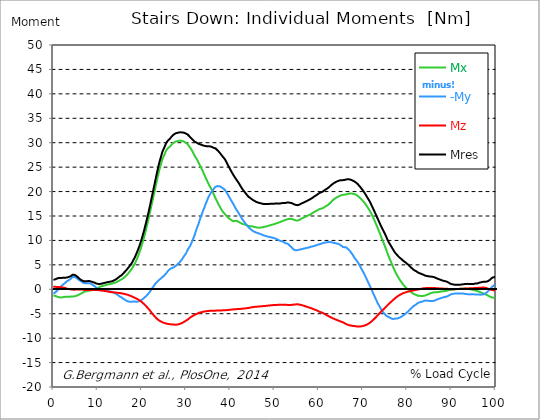
| Category |  Mx |  -My |  Mz |  Mres |
|---|---|---|---|---|
| 0.0 | -1.25 | -0.88 | 0.52 | 1.96 |
| 0.167348456675344 | -1.29 | -0.81 | 0.52 | 1.97 |
| 0.334696913350688 | -1.33 | -0.72 | 0.52 | 2 |
| 0.5020453700260321 | -1.39 | -0.57 | 0.49 | 2.09 |
| 0.669393826701376 | -1.45 | -0.42 | 0.49 | 2.15 |
| 0.83674228337672 | -1.5 | -0.27 | 0.49 | 2.22 |
| 1.0040907400520642 | -1.55 | -0.13 | 0.49 | 2.25 |
| 1.1621420602454444 | -1.6 | 0.01 | 0.5 | 2.3 |
| 1.3294905169207885 | -1.64 | 0.17 | 0.48 | 2.34 |
| 1.4968389735961325 | -1.66 | 0.33 | 0.44 | 2.32 |
| 1.6641874302714765 | -1.67 | 0.49 | 0.41 | 2.31 |
| 1.8315358869468206 | -1.66 | 0.65 | 0.39 | 2.31 |
| 1.9988843436221646 | -1.65 | 0.81 | 0.37 | 2.34 |
| 2.1662328002975086 | -1.63 | 0.96 | 0.35 | 2.35 |
| 2.333581256972853 | -1.59 | 1.08 | 0.33 | 2.35 |
| 2.5009297136481967 | -1.56 | 1.18 | 0.29 | 2.37 |
| 2.6682781703235405 | -1.54 | 1.29 | 0.26 | 2.38 |
| 2.8356266269988843 | -1.52 | 1.4 | 0.22 | 2.38 |
| 3.002975083674229 | -1.54 | 1.61 | 0.15 | 2.39 |
| 3.1703235403495724 | -1.53 | 1.68 | 0.12 | 2.44 |
| 3.337671997024917 | -1.52 | 1.76 | 0.08 | 2.48 |
| 3.4957233172182973 | -1.51 | 1.86 | 0.05 | 2.52 |
| 3.663071773893641 | -1.51 | 1.98 | 0.02 | 2.59 |
| 3.8304202305689854 | -1.5 | 2.09 | 0.01 | 2.65 |
| 3.997768687244329 | -1.49 | 2.2 | -0.02 | 2.72 |
| 4.165117143919673 | -1.49 | 2.36 | -0.04 | 2.85 |
| 4.332465600595017 | -1.49 | 2.52 | -0.06 | 2.98 |
| 4.499814057270361 | -1.47 | 2.57 | -0.07 | 3.01 |
| 4.667162513945706 | -1.45 | 2.55 | -0.09 | 2.98 |
| 4.834510970621049 | -1.43 | 2.51 | -0.1 | 2.94 |
| 5.001859427296393 | -1.39 | 2.45 | -0.06 | 2.86 |
| 5.169207883971737 | -1.33 | 2.37 | -0.04 | 2.76 |
| 5.336556340647081 | -1.28 | 2.26 | -0.03 | 2.64 |
| 5.503904797322425 | -1.22 | 2.13 | -0.03 | 2.49 |
| 5.671253253997769 | -1.16 | 2 | -0.02 | 2.35 |
| 5.82930457419115 | -1.09 | 1.9 | -0.03 | 2.23 |
| 5.996653030866494 | -1.01 | 1.77 | -0.03 | 2.08 |
| 6.164001487541838 | -0.93 | 1.68 | -0.04 | 1.97 |
| 6.331349944217181 | -0.84 | 1.6 | -0.04 | 1.88 |
| 6.498698400892526 | -0.75 | 1.49 | -0.06 | 1.79 |
| 6.66604685756787 | -0.67 | 1.39 | -0.08 | 1.71 |
| 6.833395314243213 | -0.59 | 1.31 | -0.1 | 1.66 |
| 7.000743770918558 | -0.52 | 1.26 | -0.12 | 1.63 |
| 7.168092227593902 | -0.47 | 1.24 | -0.14 | 1.64 |
| 7.335440684269246 | -0.42 | 1.25 | -0.15 | 1.66 |
| 7.50278914094459 | -0.38 | 1.24 | -0.16 | 1.66 |
| 7.6701375976199335 | -0.33 | 1.23 | -0.17 | 1.66 |
| 7.837486054295278 | -0.3 | 1.25 | -0.17 | 1.68 |
| 7.995537374488658 | -0.28 | 1.26 | -0.17 | 1.7 |
| 8.162885831164003 | -0.27 | 1.24 | -0.15 | 1.68 |
| 8.330234287839346 | -0.25 | 1.2 | -0.15 | 1.65 |
| 8.49758274451469 | -0.23 | 1.14 | -0.15 | 1.6 |
| 8.664931201190035 | -0.19 | 1.04 | -0.14 | 1.55 |
| 8.832279657865378 | -0.14 | 0.95 | -0.13 | 1.48 |
| 8.999628114540721 | -0.09 | 0.84 | -0.14 | 1.45 |
| 9.166976571216066 | -0.05 | 0.72 | -0.15 | 1.42 |
| 9.334325027891412 | 0.01 | 0.6 | -0.15 | 1.36 |
| 9.501673484566755 | 0.07 | 0.47 | -0.14 | 1.26 |
| 9.669021941242098 | 0.12 | 0.36 | -0.15 | 1.18 |
| 9.836370397917442 | 0.19 | 0.25 | -0.15 | 1.15 |
| 10.003718854592787 | 0.25 | 0.13 | -0.17 | 1.13 |
| 10.17106731126813 | 0.32 | 0 | -0.17 | 1.08 |
| 10.329118631461512 | 0.42 | -0.16 | -0.18 | 1.05 |
| 10.496467088136853 | 0.49 | -0.2 | -0.2 | 1.08 |
| 10.663815544812199 | 0.55 | -0.18 | -0.23 | 1.11 |
| 10.831164001487544 | 0.59 | -0.09 | -0.26 | 1.12 |
| 10.998512458162887 | 0.65 | -0.06 | -0.28 | 1.17 |
| 11.16586091483823 | 0.7 | -0.05 | -0.29 | 1.23 |
| 11.333209371513574 | 0.73 | -0.07 | -0.31 | 1.25 |
| 11.50055782818892 | 0.77 | -0.11 | -0.32 | 1.29 |
| 11.667906284864264 | 0.81 | -0.18 | -0.34 | 1.33 |
| 11.835254741539607 | 0.85 | -0.23 | -0.36 | 1.37 |
| 12.00260319821495 | 0.91 | -0.3 | -0.39 | 1.41 |
| 12.169951654890292 | 0.96 | -0.35 | -0.42 | 1.46 |
| 12.337300111565641 | 0.99 | -0.36 | -0.46 | 1.48 |
| 12.504648568240984 | 1.02 | -0.37 | -0.5 | 1.5 |
| 12.662699888434362 | 1.05 | -0.41 | -0.53 | 1.53 |
| 12.830048345109708 | 1.07 | -0.42 | -0.56 | 1.55 |
| 12.997396801785053 | 1.1 | -0.44 | -0.58 | 1.58 |
| 13.164745258460396 | 1.13 | -0.48 | -0.6 | 1.6 |
| 13.33209371513574 | 1.17 | -0.55 | -0.61 | 1.65 |
| 13.499442171811083 | 1.22 | -0.63 | -0.62 | 1.72 |
| 13.666790628486426 | 1.28 | -0.72 | -0.63 | 1.81 |
| 13.834139085161771 | 1.31 | -0.74 | -0.65 | 1.86 |
| 14.001487541837117 | 1.36 | -0.81 | -0.67 | 1.94 |
| 14.16883599851246 | 1.43 | -0.91 | -0.68 | 2.04 |
| 14.336184455187803 | 1.5 | -1.01 | -0.7 | 2.16 |
| 14.503532911863147 | 1.58 | -1.12 | -0.71 | 2.26 |
| 14.670881368538492 | 1.66 | -1.24 | -0.73 | 2.38 |
| 14.828932688731873 | 1.74 | -1.34 | -0.75 | 2.49 |
| 14.996281145407215 | 1.83 | -1.48 | -0.76 | 2.64 |
| 15.163629602082558 | 1.91 | -1.56 | -0.78 | 2.74 |
| 15.330978058757903 | 1.99 | -1.61 | -0.82 | 2.82 |
| 15.498326515433247 | 2.07 | -1.7 | -0.85 | 2.95 |
| 15.665674972108594 | 2.17 | -1.84 | -0.88 | 3.11 |
| 15.833023428783937 | 2.27 | -1.94 | -0.91 | 3.26 |
| 16.00037188545928 | 2.4 | -2.05 | -0.94 | 3.43 |
| 16.167720342134626 | 2.53 | -2.14 | -0.98 | 3.59 |
| 16.335068798809967 | 2.68 | -2.22 | -1.02 | 3.75 |
| 16.502417255485312 | 2.82 | -2.31 | -1.05 | 3.92 |
| 16.669765712160658 | 2.97 | -2.41 | -1.09 | 4.1 |
| 16.837114168836 | 3.14 | -2.45 | -1.14 | 4.27 |
| 17.004462625511344 | 3.34 | -2.5 | -1.2 | 4.48 |
| 17.16251394570472 | 3.54 | -2.54 | -1.25 | 4.68 |
| 17.32986240238007 | 3.72 | -2.57 | -1.31 | 4.87 |
| 17.497210859055414 | 3.9 | -2.58 | -1.37 | 5.07 |
| 17.664559315730756 | 4.11 | -2.55 | -1.43 | 5.28 |
| 17.8319077724061 | 4.34 | -2.48 | -1.5 | 5.53 |
| 17.999256229081443 | 4.59 | -2.51 | -1.57 | 5.81 |
| 18.166604685756788 | 4.86 | -2.56 | -1.63 | 6.11 |
| 18.333953142432133 | 5.12 | -2.52 | -1.69 | 6.39 |
| 18.501301599107478 | 5.4 | -2.51 | -1.77 | 6.7 |
| 18.668650055782823 | 5.73 | -2.53 | -1.85 | 7.05 |
| 18.835998512458165 | 6.08 | -2.53 | -1.93 | 7.41 |
| 19.00334696913351 | 6.42 | -2.53 | -2.01 | 7.78 |
| 19.170695425808855 | 6.79 | -2.51 | -2.1 | 8.15 |
| 19.338043882484197 | 7.2 | -2.44 | -2.19 | 8.56 |
| 19.496095202677576 | 7.64 | -2.42 | -2.29 | 8.98 |
| 19.66344365935292 | 8.09 | -2.36 | -2.39 | 9.43 |
| 19.830792116028263 | 8.57 | -2.26 | -2.5 | 9.89 |
| 19.998140572703612 | 9.05 | -2.14 | -2.62 | 10.39 |
| 20.165489029378953 | 9.55 | -2.01 | -2.76 | 10.91 |
| 20.3328374860543 | 10.09 | -1.92 | -2.89 | 11.44 |
| 20.500185942729644 | 10.65 | -1.78 | -3.03 | 12 |
| 20.667534399404985 | 11.21 | -1.64 | -3.17 | 12.57 |
| 20.83488285608033 | 11.81 | -1.5 | -3.32 | 13.16 |
| 21.002231312755672 | 12.44 | -1.37 | -3.48 | 13.78 |
| 21.16957976943102 | 13.1 | -1.23 | -3.65 | 14.43 |
| 21.336928226106362 | 13.74 | -1.05 | -3.82 | 15.07 |
| 21.504276682781704 | 14.38 | -0.87 | -4 | 15.71 |
| 21.67162513945705 | 15.03 | -0.68 | -4.17 | 16.37 |
| 21.82967645965043 | 15.72 | -0.49 | -4.35 | 17.06 |
| 21.997024916325774 | 16.41 | -0.26 | -4.55 | 17.77 |
| 22.16437337300112 | 17.1 | -0.03 | -4.74 | 18.49 |
| 22.33172182967646 | 17.77 | 0.18 | -4.94 | 19.18 |
| 22.499070286351806 | 18.46 | 0.41 | -5.12 | 19.89 |
| 22.666418743027148 | 19.15 | 0.62 | -5.29 | 20.6 |
| 22.833767199702496 | 19.84 | 0.83 | -5.46 | 21.31 |
| 23.00111565637784 | 20.54 | 1.03 | -5.64 | 22.03 |
| 23.168464113053183 | 21.24 | 1.23 | -5.82 | 22.77 |
| 23.335812569728528 | 21.95 | 1.39 | -5.97 | 23.48 |
| 23.50316102640387 | 22.62 | 1.55 | -6.09 | 24.15 |
| 23.670509483079215 | 23.28 | 1.71 | -6.22 | 24.82 |
| 23.83785793975456 | 23.95 | 1.87 | -6.34 | 25.48 |
| 23.995909259947936 | 24.56 | 1.99 | -6.43 | 26.09 |
| 24.163257716623285 | 25.06 | 2.11 | -6.52 | 26.59 |
| 24.330606173298627 | 25.61 | 2.23 | -6.6 | 27.13 |
| 24.49795462997397 | 26.17 | 2.35 | -6.68 | 27.68 |
| 24.665303086649313 | 26.68 | 2.47 | -6.76 | 28.19 |
| 24.83265154332466 | 27.02 | 2.63 | -6.81 | 28.52 |
| 25.0 | 27.34 | 2.79 | -6.86 | 28.84 |
| 25.167348456675345 | 27.68 | 2.92 | -6.91 | 29.19 |
| 25.334696913350694 | 28.04 | 3.09 | -6.97 | 29.56 |
| 25.502045370026035 | 28.38 | 3.25 | -7.02 | 29.91 |
| 25.669393826701377 | 28.6 | 3.45 | -7.05 | 30.14 |
| 25.836742283376722 | 28.79 | 3.65 | -7.08 | 30.34 |
| 26.004090740052067 | 28.97 | 3.81 | -7.1 | 30.54 |
| 26.17143919672741 | 29.06 | 3.98 | -7.13 | 30.65 |
| 26.329490516920792 | 29.17 | 4.13 | -7.15 | 30.78 |
| 26.49683897359613 | 29.35 | 4.22 | -7.16 | 30.98 |
| 26.66418743027148 | 29.54 | 4.29 | -7.18 | 31.17 |
| 26.831535886946828 | 29.72 | 4.34 | -7.21 | 31.36 |
| 26.998884343622166 | 29.86 | 4.39 | -7.22 | 31.51 |
| 27.166232800297514 | 29.99 | 4.46 | -7.22 | 31.65 |
| 27.333581256972852 | 30.07 | 4.56 | -7.22 | 31.74 |
| 27.5009297136482 | 30.16 | 4.66 | -7.24 | 31.83 |
| 27.668278170323543 | 30.25 | 4.75 | -7.25 | 31.93 |
| 27.835626626998888 | 30.27 | 4.91 | -7.24 | 31.97 |
| 28.002975083674233 | 30.3 | 5.07 | -7.22 | 32 |
| 28.170323540349575 | 30.35 | 5.2 | -7.19 | 32.05 |
| 28.33767199702492 | 30.38 | 5.31 | -7.15 | 32.08 |
| 28.50502045370026 | 30.41 | 5.46 | -7.1 | 32.11 |
| 28.663071773893645 | 30.42 | 5.66 | -7.06 | 32.13 |
| 28.830420230568986 | 30.41 | 5.85 | -7 | 32.12 |
| 28.99776868724433 | 30.38 | 6.03 | -6.93 | 32.11 |
| 29.165117143919673 | 30.35 | 6.24 | -6.85 | 32.1 |
| 29.33246560059502 | 30.32 | 6.49 | -6.78 | 32.09 |
| 29.499814057270367 | 30.26 | 6.73 | -6.7 | 32.06 |
| 29.66716251394571 | 30.16 | 6.96 | -6.61 | 31.99 |
| 29.834510970621054 | 30.05 | 7.15 | -6.5 | 31.9 |
| 30.00185942729639 | 29.99 | 7.36 | -6.4 | 31.86 |
| 30.169207883971744 | 29.88 | 7.67 | -6.31 | 31.8 |
| 30.33655634064708 | 29.72 | 8.02 | -6.23 | 31.71 |
| 30.50390479732243 | 29.54 | 8.29 | -6.11 | 31.57 |
| 30.671253253997772 | 29.34 | 8.52 | -5.98 | 31.4 |
| 30.829304574191156 | 29.12 | 8.73 | -5.85 | 31.22 |
| 30.996653030866494 | 28.9 | 9.01 | -5.73 | 31.07 |
| 31.164001487541842 | 28.67 | 9.4 | -5.65 | 30.94 |
| 31.331349944217187 | 28.4 | 9.71 | -5.55 | 30.77 |
| 31.498698400892525 | 28.12 | 10.06 | -5.46 | 30.62 |
| 31.666046857567874 | 27.82 | 10.46 | -5.38 | 30.47 |
| 31.833395314243212 | 27.53 | 10.83 | -5.29 | 30.31 |
| 32.00074377091856 | 27.26 | 11.26 | -5.21 | 30.18 |
| 32.1680922275939 | 27.01 | 11.76 | -5.15 | 30.13 |
| 32.33544068426925 | 26.76 | 12.21 | -5.08 | 30.05 |
| 32.50278914094459 | 26.5 | 12.63 | -5 | 29.95 |
| 32.670137597619934 | 26.23 | 13.03 | -4.93 | 29.86 |
| 32.83748605429528 | 25.93 | 13.42 | -4.87 | 29.75 |
| 33.004834510970625 | 25.63 | 13.91 | -4.8 | 29.72 |
| 33.162885831164004 | 25.33 | 14.38 | -4.76 | 29.69 |
| 33.33023428783935 | 25.02 | 14.85 | -4.72 | 29.63 |
| 33.497582744514695 | 24.72 | 15.24 | -4.69 | 29.56 |
| 33.664931201190036 | 24.4 | 15.64 | -4.65 | 29.49 |
| 33.83227965786538 | 24.07 | 16.06 | -4.62 | 29.46 |
| 33.99962811454073 | 23.71 | 16.43 | -4.56 | 29.41 |
| 34.16697657121607 | 23.37 | 16.78 | -4.53 | 29.34 |
| 34.33432502789141 | 23.05 | 17.2 | -4.51 | 29.32 |
| 34.50167348456676 | 22.72 | 17.6 | -4.49 | 29.31 |
| 34.6690219412421 | 22.39 | 17.98 | -4.48 | 29.29 |
| 34.83637039791744 | 22.06 | 18.35 | -4.46 | 29.28 |
| 35.00371885459279 | 21.73 | 18.72 | -4.44 | 29.27 |
| 35.17106731126814 | 21.42 | 19.05 | -4.42 | 29.27 |
| 35.338415767943474 | 21.15 | 19.32 | -4.41 | 29.25 |
| 35.49646708813686 | 20.89 | 19.55 | -4.4 | 29.21 |
| 35.6638155448122 | 20.58 | 19.84 | -4.4 | 29.2 |
| 35.831164001487544 | 20.26 | 20.06 | -4.4 | 29.15 |
| 35.998512458162885 | 19.95 | 20.23 | -4.39 | 29.06 |
| 36.165860914838234 | 19.64 | 20.4 | -4.39 | 28.98 |
| 36.333209371513576 | 19.29 | 20.63 | -4.38 | 28.93 |
| 36.50055782818892 | 18.95 | 20.87 | -4.38 | 28.91 |
| 36.667906284864266 | 18.62 | 21.03 | -4.37 | 28.84 |
| 36.83525474153961 | 18.31 | 21.05 | -4.37 | 28.68 |
| 37.002603198214956 | 18.01 | 21.08 | -4.36 | 28.53 |
| 37.1699516548903 | 17.7 | 21.12 | -4.36 | 28.4 |
| 37.337300111565646 | 17.41 | 21.13 | -4.35 | 28.25 |
| 37.50464856824098 | 17.13 | 21.1 | -4.34 | 28.08 |
| 37.66269988843437 | 16.85 | 21.04 | -4.33 | 27.89 |
| 37.83004834510971 | 16.58 | 20.97 | -4.33 | 27.7 |
| 37.99739680178505 | 16.31 | 20.89 | -4.32 | 27.5 |
| 38.16474525846039 | 16.09 | 20.77 | -4.31 | 27.3 |
| 38.33209371513574 | 15.87 | 20.67 | -4.31 | 27.1 |
| 38.49944217181109 | 15.68 | 20.58 | -4.31 | 26.95 |
| 38.666790628486424 | 15.52 | 20.46 | -4.3 | 26.76 |
| 38.83413908516178 | 15.36 | 20.27 | -4.29 | 26.53 |
| 39.001487541837115 | 15.17 | 20.07 | -4.28 | 26.27 |
| 39.16883599851246 | 15 | 19.81 | -4.27 | 25.96 |
| 39.336184455187805 | 14.82 | 19.58 | -4.25 | 25.67 |
| 39.503532911863154 | 14.66 | 19.32 | -4.24 | 25.38 |
| 39.670881368538495 | 14.54 | 19.03 | -4.22 | 25.07 |
| 39.83822982521384 | 14.43 | 18.77 | -4.2 | 24.8 |
| 39.996281145407224 | 14.32 | 18.5 | -4.18 | 24.52 |
| 40.163629602082565 | 14.22 | 18.24 | -4.17 | 24.24 |
| 40.33097805875791 | 14.12 | 17.98 | -4.15 | 23.97 |
| 40.498326515433256 | 14.02 | 17.74 | -4.13 | 23.71 |
| 40.6656749721086 | 13.94 | 17.48 | -4.12 | 23.44 |
| 40.83302342878393 | 13.91 | 17.24 | -4.1 | 23.21 |
| 41.00037188545929 | 13.98 | 16.92 | -4.09 | 22.96 |
| 41.16772034213463 | 14.01 | 16.63 | -4.08 | 22.73 |
| 41.33506879880997 | 14.02 | 16.36 | -4.07 | 22.52 |
| 41.50241725548531 | 13.93 | 16.15 | -4.06 | 22.29 |
| 41.66976571216066 | 13.89 | 15.93 | -4.05 | 22.1 |
| 41.837114168836 | 13.82 | 15.68 | -4.05 | 21.85 |
| 42.004462625511344 | 13.75 | 15.43 | -4.04 | 21.61 |
| 42.17181108218669 | 13.67 | 15.17 | -4.03 | 21.36 |
| 42.32986240238007 | 13.58 | 14.91 | -4.01 | 21.1 |
| 42.497210859055414 | 13.49 | 14.66 | -4 | 20.84 |
| 42.66455931573076 | 13.4 | 14.44 | -3.97 | 20.61 |
| 42.831907772406105 | 13.35 | 14.21 | -3.96 | 20.39 |
| 42.999256229081446 | 13.32 | 14 | -3.95 | 20.21 |
| 43.16660468575679 | 13.3 | 13.78 | -3.93 | 20.02 |
| 43.33395314243214 | 13.25 | 13.58 | -3.92 | 19.83 |
| 43.50130159910748 | 13.17 | 13.38 | -3.9 | 19.62 |
| 43.66865005578282 | 13.1 | 13.2 | -3.88 | 19.43 |
| 43.83599851245817 | 13.02 | 13.02 | -3.86 | 19.24 |
| 44.00334696913351 | 12.97 | 12.84 | -3.83 | 19.07 |
| 44.17069542580886 | 12.93 | 12.68 | -3.82 | 18.91 |
| 44.3380438824842 | 12.93 | 12.54 | -3.79 | 18.8 |
| 44.49609520267758 | 12.93 | 12.4 | -3.75 | 18.7 |
| 44.66344365935292 | 12.92 | 12.26 | -3.72 | 18.58 |
| 44.83079211602827 | 12.89 | 12.12 | -3.69 | 18.46 |
| 44.99814057270361 | 12.87 | 12 | -3.66 | 18.34 |
| 45.16548902937895 | 12.83 | 11.9 | -3.64 | 18.25 |
| 45.332837486054295 | 12.79 | 11.81 | -3.62 | 18.15 |
| 45.500185942729644 | 12.75 | 11.76 | -3.6 | 18.08 |
| 45.66753439940499 | 12.71 | 11.71 | -3.59 | 18.01 |
| 45.83488285608033 | 12.67 | 11.62 | -3.58 | 17.91 |
| 46.00223131275568 | 12.63 | 11.57 | -3.56 | 17.84 |
| 46.16957976943102 | 12.61 | 11.51 | -3.55 | 17.78 |
| 46.336928226106366 | 12.62 | 11.46 | -3.54 | 17.73 |
| 46.50427668278171 | 12.62 | 11.42 | -3.52 | 17.69 |
| 46.671625139457056 | 12.62 | 11.37 | -3.51 | 17.66 |
| 46.829676459650436 | 12.63 | 11.32 | -3.49 | 17.62 |
| 46.99702491632577 | 12.65 | 11.25 | -3.48 | 17.58 |
| 47.16437337300112 | 12.67 | 11.18 | -3.47 | 17.54 |
| 47.33172182967646 | 12.69 | 11.11 | -3.45 | 17.5 |
| 47.49907028635181 | 12.71 | 11.05 | -3.44 | 17.46 |
| 47.66641874302716 | 12.76 | 11.01 | -3.43 | 17.46 |
| 47.83376719970249 | 12.8 | 10.96 | -3.42 | 17.46 |
| 48.001115656377834 | 12.84 | 10.91 | -3.4 | 17.45 |
| 48.16846411305319 | 12.87 | 10.86 | -3.39 | 17.44 |
| 48.33581256972853 | 12.92 | 10.81 | -3.37 | 17.44 |
| 48.50316102640387 | 12.97 | 10.78 | -3.35 | 17.45 |
| 48.67050948307921 | 13.01 | 10.76 | -3.33 | 17.46 |
| 48.837857939754564 | 13.06 | 10.72 | -3.32 | 17.48 |
| 49.005206396429905 | 13.11 | 10.7 | -3.3 | 17.49 |
| 49.163257716623285 | 13.14 | 10.66 | -3.28 | 17.49 |
| 49.33060617329863 | 13.18 | 10.62 | -3.27 | 17.49 |
| 49.49795462997397 | 13.22 | 10.57 | -3.25 | 17.49 |
| 49.66530308664932 | 13.27 | 10.53 | -3.24 | 17.5 |
| 49.832651543324666 | 13.31 | 10.48 | -3.24 | 17.51 |
| 50.0 | 13.36 | 10.43 | -3.23 | 17.52 |
| 50.16734845667534 | 13.42 | 10.4 | -3.23 | 17.55 |
| 50.33469691335069 | 13.48 | 10.37 | -3.23 | 17.58 |
| 50.50204537002604 | 13.53 | 10.28 | -3.2 | 17.56 |
| 50.66939382670139 | 13.58 | 10.2 | -3.19 | 17.55 |
| 50.836742283376715 | 13.62 | 10.1 | -3.16 | 17.53 |
| 51.00409074005207 | 13.68 | 10.04 | -3.16 | 17.56 |
| 51.17143919672741 | 13.74 | 9.96 | -3.16 | 17.55 |
| 51.32949051692079 | 13.8 | 9.9 | -3.16 | 17.57 |
| 51.496838973596134 | 13.86 | 9.85 | -3.17 | 17.6 |
| 51.66418743027148 | 13.91 | 9.83 | -3.18 | 17.64 |
| 51.831535886946824 | 13.97 | 9.79 | -3.18 | 17.66 |
| 51.99888434362217 | 14.03 | 9.73 | -3.18 | 17.68 |
| 52.16623280029752 | 14.08 | 9.63 | -3.18 | 17.68 |
| 52.33358125697285 | 14.14 | 9.52 | -3.16 | 17.66 |
| 52.5009297136482 | 14.2 | 9.43 | -3.16 | 17.67 |
| 52.668278170323546 | 14.26 | 9.41 | -3.17 | 17.73 |
| 52.835626626998895 | 14.31 | 9.38 | -3.19 | 17.77 |
| 53.00297508367424 | 14.35 | 9.31 | -3.21 | 17.78 |
| 53.17032354034958 | 14.37 | 9.19 | -3.22 | 17.76 |
| 53.33767199702492 | 14.39 | 9.06 | -3.22 | 17.74 |
| 53.50502045370027 | 14.41 | 8.89 | -3.21 | 17.71 |
| 53.663071773893655 | 14.42 | 8.76 | -3.21 | 17.69 |
| 53.83042023056899 | 14.42 | 8.62 | -3.2 | 17.66 |
| 53.99776868724433 | 14.4 | 8.46 | -3.18 | 17.61 |
| 54.16511714391967 | 14.32 | 8.29 | -3.16 | 17.51 |
| 54.33246560059503 | 14.23 | 8.14 | -3.14 | 17.42 |
| 54.49981405727037 | 14.18 | 8.04 | -3.14 | 17.35 |
| 54.667162513945705 | 14.14 | 7.99 | -3.12 | 17.31 |
| 54.834510970621054 | 14.11 | 7.98 | -3.09 | 17.28 |
| 55.0018594272964 | 14.07 | 8 | -3.07 | 17.24 |
| 55.169207883971744 | 14.07 | 8.01 | -3.07 | 17.22 |
| 55.336556340647086 | 14.1 | 8.06 | -3.08 | 17.23 |
| 55.50390479732243 | 14.16 | 8.09 | -3.11 | 17.28 |
| 55.671253253997776 | 14.23 | 8.14 | -3.13 | 17.34 |
| 55.83860171067312 | 14.31 | 8.15 | -3.17 | 17.42 |
| 55.9966530308665 | 14.41 | 8.19 | -3.21 | 17.52 |
| 56.16400148754184 | 14.49 | 8.23 | -3.25 | 17.6 |
| 56.33134994421718 | 14.56 | 8.27 | -3.29 | 17.65 |
| 56.498698400892536 | 14.63 | 8.3 | -3.34 | 17.72 |
| 56.66604685756788 | 14.71 | 8.34 | -3.38 | 17.8 |
| 56.83339531424321 | 14.78 | 8.37 | -3.43 | 17.87 |
| 57.00074377091856 | 14.85 | 8.41 | -3.48 | 17.95 |
| 57.16809222759391 | 14.92 | 8.45 | -3.53 | 18.02 |
| 57.33544068426925 | 14.99 | 8.46 | -3.58 | 18.09 |
| 57.5027891409446 | 15.07 | 8.5 | -3.64 | 18.17 |
| 57.670137597619934 | 15.14 | 8.53 | -3.69 | 18.24 |
| 57.83748605429528 | 15.21 | 8.58 | -3.73 | 18.31 |
| 58.004834510970625 | 15.27 | 8.65 | -3.78 | 18.39 |
| 58.16288583116401 | 15.36 | 8.69 | -3.83 | 18.49 |
| 58.330234287839346 | 15.45 | 8.72 | -3.88 | 18.58 |
| 58.497582744514695 | 15.54 | 8.75 | -3.94 | 18.67 |
| 58.66493120119004 | 15.64 | 8.78 | -4.01 | 18.78 |
| 58.832279657865385 | 15.74 | 8.83 | -4.07 | 18.88 |
| 58.999628114540734 | 15.83 | 8.87 | -4.13 | 18.99 |
| 59.16697657121607 | 15.92 | 8.92 | -4.2 | 19.1 |
| 59.33432502789142 | 15.99 | 8.97 | -4.25 | 19.19 |
| 59.50167348456676 | 16.07 | 9.02 | -4.3 | 19.28 |
| 59.66902194124211 | 16.15 | 9.07 | -4.37 | 19.38 |
| 59.83637039791745 | 16.24 | 9.13 | -4.45 | 19.5 |
| 60.00371885459278 | 16.33 | 9.18 | -4.53 | 19.61 |
| 60.17106731126813 | 16.43 | 9.21 | -4.6 | 19.72 |
| 60.33841576794349 | 16.47 | 9.25 | -4.65 | 19.78 |
| 60.49646708813685 | 16.5 | 9.3 | -4.7 | 19.83 |
| 60.6638155448122 | 16.53 | 9.37 | -4.75 | 19.88 |
| 60.831164001487544 | 16.57 | 9.43 | -4.82 | 19.96 |
| 60.99851245816289 | 16.65 | 9.47 | -4.89 | 20.05 |
| 61.16586091483824 | 16.74 | 9.52 | -4.98 | 20.17 |
| 61.333209371513576 | 16.84 | 9.55 | -5.06 | 20.28 |
| 61.50055782818892 | 16.94 | 9.57 | -5.14 | 20.38 |
| 61.667906284864266 | 17.03 | 9.59 | -5.23 | 20.48 |
| 61.835254741539615 | 17.12 | 9.61 | -5.31 | 20.57 |
| 62.002603198214956 | 17.21 | 9.63 | -5.39 | 20.67 |
| 62.16995165489029 | 17.32 | 9.65 | -5.47 | 20.78 |
| 62.33730011156564 | 17.44 | 9.66 | -5.55 | 20.91 |
| 62.504648568240995 | 17.57 | 9.67 | -5.63 | 21.04 |
| 62.67199702491633 | 17.73 | 9.66 | -5.7 | 21.18 |
| 62.83004834510971 | 17.9 | 9.63 | -5.78 | 21.32 |
| 62.99739680178505 | 18.06 | 9.61 | -5.85 | 21.45 |
| 63.1647452584604 | 18.2 | 9.56 | -5.92 | 21.56 |
| 63.33209371513575 | 18.34 | 9.52 | -5.99 | 21.67 |
| 63.4994421718111 | 18.46 | 9.48 | -6.05 | 21.77 |
| 63.666790628486424 | 18.57 | 9.45 | -6.12 | 21.86 |
| 63.83413908516177 | 18.68 | 9.41 | -6.18 | 21.94 |
| 64.00148754183712 | 18.77 | 9.39 | -6.24 | 22.02 |
| 64.16883599851248 | 18.86 | 9.35 | -6.31 | 22.09 |
| 64.3361844551878 | 18.93 | 9.33 | -6.37 | 22.16 |
| 64.50353291186315 | 19.01 | 9.28 | -6.43 | 22.21 |
| 64.6708813685385 | 19.08 | 9.2 | -6.49 | 22.26 |
| 64.83822982521384 | 19.15 | 9.1 | -6.54 | 22.29 |
| 65.00557828188919 | 19.22 | 8.99 | -6.6 | 22.31 |
| 65.16362960208257 | 19.28 | 8.87 | -6.65 | 22.32 |
| 65.3309780587579 | 19.31 | 8.77 | -6.71 | 22.33 |
| 65.49832651543326 | 19.35 | 8.66 | -6.77 | 22.34 |
| 65.6656749721086 | 19.37 | 8.61 | -6.84 | 22.36 |
| 65.83302342878395 | 19.37 | 8.59 | -6.93 | 22.38 |
| 66.00037188545929 | 19.38 | 8.59 | -7.03 | 22.43 |
| 66.16772034213463 | 19.41 | 8.58 | -7.13 | 22.48 |
| 66.33506879880998 | 19.46 | 8.46 | -7.18 | 22.5 |
| 66.50241725548531 | 19.51 | 8.32 | -7.24 | 22.51 |
| 66.66976571216065 | 19.54 | 8.17 | -7.27 | 22.5 |
| 66.83711416883601 | 19.56 | 8.07 | -7.33 | 22.5 |
| 67.00446262551135 | 19.58 | 7.97 | -7.39 | 22.51 |
| 67.1718110821867 | 19.6 | 7.73 | -7.41 | 22.45 |
| 67.32986240238007 | 19.61 | 7.49 | -7.42 | 22.4 |
| 67.49721085905541 | 19.59 | 7.31 | -7.46 | 22.34 |
| 67.66455931573076 | 19.56 | 7.09 | -7.5 | 22.27 |
| 67.83190777240611 | 19.54 | 6.81 | -7.5 | 22.18 |
| 67.99925622908145 | 19.51 | 6.56 | -7.52 | 22.1 |
| 68.16660468575678 | 19.47 | 6.35 | -7.54 | 22.01 |
| 68.33395314243214 | 19.41 | 6.15 | -7.57 | 21.92 |
| 68.50130159910749 | 19.31 | 5.97 | -7.59 | 21.8 |
| 68.66865005578282 | 19.21 | 5.77 | -7.61 | 21.67 |
| 68.83599851245816 | 19.1 | 5.53 | -7.63 | 21.52 |
| 69.00334696913352 | 18.98 | 5.28 | -7.64 | 21.35 |
| 69.17069542580886 | 18.84 | 5.03 | -7.64 | 21.17 |
| 69.3380438824842 | 18.69 | 4.78 | -7.63 | 20.98 |
| 69.50539233915956 | 18.56 | 4.47 | -7.6 | 20.81 |
| 69.66344365935292 | 18.41 | 4.18 | -7.57 | 20.61 |
| 69.83079211602826 | 18.25 | 3.91 | -7.55 | 20.41 |
| 69.99814057270362 | 18.07 | 3.64 | -7.52 | 20.21 |
| 70.16548902937896 | 17.9 | 3.34 | -7.47 | 19.99 |
| 70.33283748605429 | 17.72 | 3.03 | -7.42 | 19.77 |
| 70.50018594272964 | 17.53 | 2.73 | -7.38 | 19.54 |
| 70.667534399405 | 17.3 | 2.43 | -7.31 | 19.28 |
| 70.83488285608033 | 17.07 | 2.1 | -7.25 | 19.03 |
| 71.00223131275568 | 16.85 | 1.78 | -7.17 | 18.78 |
| 71.16957976943102 | 16.61 | 1.46 | -7.09 | 18.53 |
| 71.33692822610637 | 16.38 | 1.12 | -6.99 | 18.28 |
| 71.50427668278171 | 16.15 | 0.81 | -6.9 | 18.04 |
| 71.67162513945706 | 15.87 | 0.48 | -6.79 | 17.75 |
| 71.8389735961324 | 15.57 | 0.15 | -6.66 | 17.42 |
| 71.99702491632577 | 15.27 | -0.18 | -6.53 | 17.08 |
| 72.16437337300113 | 14.98 | -0.52 | -6.4 | 16.78 |
| 72.33172182967647 | 14.65 | -0.85 | -6.25 | 16.44 |
| 72.49907028635181 | 14.32 | -1.18 | -6.11 | 16.12 |
| 72.66641874302715 | 13.97 | -1.52 | -5.95 | 15.79 |
| 72.8337671997025 | 13.61 | -1.86 | -5.8 | 15.47 |
| 73.00111565637783 | 13.25 | -2.18 | -5.65 | 15.13 |
| 73.16846411305319 | 12.89 | -2.51 | -5.48 | 14.78 |
| 73.33581256972853 | 12.54 | -2.82 | -5.32 | 14.45 |
| 73.50316102640387 | 12.17 | -3.1 | -5.16 | 14.13 |
| 73.67050948307921 | 11.79 | -3.37 | -5 | 13.78 |
| 73.83785793975457 | 11.42 | -3.65 | -4.84 | 13.44 |
| 74.00520639642991 | 11.02 | -3.91 | -4.69 | 13.12 |
| 74.16325771662328 | 10.64 | -4.18 | -4.53 | 12.8 |
| 74.33060617329863 | 10.27 | -4.4 | -4.37 | 12.51 |
| 74.49795462997398 | 9.9 | -4.63 | -4.22 | 12.2 |
| 74.66530308664932 | 9.5 | -4.8 | -4.09 | 11.91 |
| 74.83265154332466 | 9.12 | -4.97 | -3.94 | 11.59 |
| 75.00000000000001 | 8.73 | -5.17 | -3.78 | 11.28 |
| 75.16734845667534 | 8.33 | -5.32 | -3.62 | 10.95 |
| 75.3346969133507 | 7.91 | -5.46 | -3.46 | 10.62 |
| 75.50204537002605 | 7.48 | -5.55 | -3.31 | 10.25 |
| 75.66939382670138 | 7.08 | -5.63 | -3.16 | 9.93 |
| 75.83674228337672 | 6.7 | -5.69 | -3.01 | 9.63 |
| 76.00409074005208 | 6.34 | -5.77 | -2.87 | 9.38 |
| 76.17143919672742 | 5.99 | -5.86 | -2.73 | 9.13 |
| 76.33878765340276 | 5.62 | -5.95 | -2.59 | 8.88 |
| 76.49683897359614 | 5.25 | -6.01 | -2.44 | 8.62 |
| 76.66418743027148 | 4.89 | -6.06 | -2.3 | 8.36 |
| 76.83153588694682 | 4.52 | -6.08 | -2.17 | 8.12 |
| 76.99888434362218 | 4.17 | -6.05 | -2.04 | 7.86 |
| 77.16623280029752 | 3.83 | -6.03 | -1.91 | 7.61 |
| 77.33358125697285 | 3.52 | -6 | -1.78 | 7.39 |
| 77.5009297136482 | 3.24 | -5.99 | -1.66 | 7.22 |
| 77.66827817032356 | 2.97 | -6 | -1.54 | 7.08 |
| 77.83562662699889 | 2.7 | -5.97 | -1.43 | 6.93 |
| 78.00297508367423 | 2.43 | -5.9 | -1.33 | 6.75 |
| 78.17032354034959 | 2.17 | -5.84 | -1.24 | 6.58 |
| 78.33767199702493 | 1.94 | -5.77 | -1.15 | 6.45 |
| 78.50502045370027 | 1.72 | -5.71 | -1.06 | 6.33 |
| 78.67236891037561 | 1.5 | -5.63 | -0.98 | 6.21 |
| 78.83042023056899 | 1.28 | -5.53 | -0.91 | 6.06 |
| 78.99776868724433 | 1.08 | -5.42 | -0.84 | 5.92 |
| 79.16511714391969 | 0.89 | -5.31 | -0.77 | 5.79 |
| 79.33246560059503 | 0.72 | -5.2 | -0.71 | 5.68 |
| 79.49981405727036 | 0.55 | -5.09 | -0.67 | 5.59 |
| 79.66716251394571 | 0.39 | -4.97 | -0.63 | 5.47 |
| 79.83451097062107 | 0.23 | -4.83 | -0.58 | 5.32 |
| 80.00185942729641 | 0.1 | -4.71 | -0.53 | 5.2 |
| 80.16920788397174 | -0.02 | -4.59 | -0.49 | 5.1 |
| 80.33655634064709 | -0.15 | -4.45 | -0.45 | 4.96 |
| 80.50390479732243 | -0.29 | -4.27 | -0.41 | 4.79 |
| 80.67125325399778 | -0.42 | -4.11 | -0.38 | 4.63 |
| 80.83860171067312 | -0.53 | -3.97 | -0.34 | 4.5 |
| 80.99665303086651 | -0.66 | -3.83 | -0.31 | 4.36 |
| 81.16400148754184 | -0.78 | -3.68 | -0.28 | 4.23 |
| 81.3313499442172 | -0.89 | -3.52 | -0.25 | 4.08 |
| 81.49869840089255 | -0.97 | -3.39 | -0.22 | 3.95 |
| 81.66604685756786 | -1.03 | -3.3 | -0.19 | 3.87 |
| 81.83339531424322 | -1.07 | -3.24 | -0.15 | 3.82 |
| 82.00074377091858 | -1.15 | -3.12 | -0.12 | 3.72 |
| 82.16809222759392 | -1.23 | -2.98 | -0.09 | 3.6 |
| 82.33544068426926 | -1.3 | -2.87 | -0.07 | 3.5 |
| 82.50278914094459 | -1.35 | -2.78 | -0.04 | 3.41 |
| 82.67013759761994 | -1.35 | -2.72 | 0 | 3.34 |
| 82.83748605429528 | -1.34 | -2.67 | 0.03 | 3.27 |
| 83.00483451097062 | -1.35 | -2.62 | 0.07 | 3.21 |
| 83.17218296764597 | -1.36 | -2.56 | 0.1 | 3.15 |
| 83.33023428783935 | -1.37 | -2.52 | 0.14 | 3.1 |
| 83.4975827445147 | -1.36 | -2.49 | 0.17 | 3.05 |
| 83.66493120119004 | -1.34 | -2.44 | 0.2 | 2.98 |
| 83.83227965786537 | -1.32 | -2.37 | 0.21 | 2.9 |
| 83.99962811454073 | -1.29 | -2.32 | 0.23 | 2.82 |
| 84.16697657121607 | -1.24 | -2.29 | 0.24 | 2.77 |
| 84.33432502789142 | -1.18 | -2.3 | 0.25 | 2.74 |
| 84.50167348456677 | -1.11 | -2.34 | 0.26 | 2.71 |
| 84.6690219412421 | -1.04 | -2.37 | 0.27 | 2.69 |
| 84.83637039791745 | -0.99 | -2.37 | 0.27 | 2.66 |
| 85.0037188545928 | -0.91 | -2.37 | 0.27 | 2.62 |
| 85.17106731126813 | -0.86 | -2.38 | 0.28 | 2.61 |
| 85.33841576794349 | -0.8 | -2.4 | 0.29 | 2.6 |
| 85.50576422461883 | -0.75 | -2.4 | 0.28 | 2.59 |
| 85.66381554481221 | -0.7 | -2.4 | 0.28 | 2.57 |
| 85.83116400148755 | -0.65 | -2.39 | 0.28 | 2.54 |
| 85.99851245816289 | -0.63 | -2.36 | 0.27 | 2.5 |
| 86.16586091483823 | -0.61 | -2.32 | 0.25 | 2.45 |
| 86.33320937151358 | -0.61 | -2.26 | 0.25 | 2.39 |
| 86.50055782818893 | -0.61 | -2.19 | 0.23 | 2.32 |
| 86.66790628486427 | -0.6 | -2.13 | 0.22 | 2.25 |
| 86.83525474153961 | -0.59 | -2.06 | 0.21 | 2.19 |
| 87.00260319821496 | -0.57 | -2 | 0.19 | 2.12 |
| 87.16995165489031 | -0.55 | -1.94 | 0.18 | 2.06 |
| 87.33730011156564 | -0.52 | -1.9 | 0.18 | 2.01 |
| 87.504648568241 | -0.49 | -1.85 | 0.17 | 1.96 |
| 87.67199702491634 | -0.47 | -1.8 | 0.16 | 1.9 |
| 87.83004834510972 | -0.44 | -1.74 | 0.15 | 1.84 |
| 87.99739680178506 | -0.42 | -1.69 | 0.14 | 1.79 |
| 88.1647452584604 | -0.4 | -1.64 | 0.13 | 1.74 |
| 88.33209371513574 | -0.37 | -1.6 | 0.13 | 1.7 |
| 88.49944217181108 | -0.36 | -1.58 | 0.13 | 1.67 |
| 88.66679062848644 | -0.34 | -1.55 | 0.13 | 1.64 |
| 88.83413908516178 | -0.32 | -1.52 | 0.12 | 1.6 |
| 89.00148754183712 | -0.3 | -1.47 | 0.12 | 1.55 |
| 89.16883599851246 | -0.25 | -1.4 | 0.09 | 1.47 |
| 89.33618445518782 | -0.19 | -1.32 | 0.06 | 1.38 |
| 89.50353291186315 | -0.15 | -1.23 | 0.02 | 1.28 |
| 89.6708813685385 | -0.12 | -1.14 | 0 | 1.19 |
| 89.83822982521386 | -0.09 | -1.06 | -0.01 | 1.11 |
| 90.00557828188919 | -0.07 | -1 | -0.01 | 1.06 |
| 90.16362960208257 | -0.06 | -0.96 | 0 | 1.02 |
| 90.3309780587579 | -0.06 | -0.93 | 0.01 | 1 |
| 90.49832651543326 | -0.04 | -0.91 | 0.02 | 0.98 |
| 90.66567497210859 | -0.02 | -0.89 | 0.02 | 0.95 |
| 90.83302342878395 | -0.01 | -0.87 | 0.03 | 0.93 |
| 91.00037188545929 | 0 | -0.86 | 0.04 | 0.92 |
| 91.16772034213463 | 0.02 | -0.85 | 0.05 | 0.91 |
| 91.33506879880998 | 0.04 | -0.85 | 0.06 | 0.91 |
| 91.50241725548533 | 0.05 | -0.86 | 0.07 | 0.91 |
| 91.66976571216065 | 0.07 | -0.85 | 0.08 | 0.91 |
| 91.83711416883601 | 0.08 | -0.86 | 0.09 | 0.92 |
| 92.00446262551137 | 0.09 | -0.86 | 0.1 | 0.94 |
| 92.1718110821867 | 0.11 | -0.85 | 0.11 | 0.96 |
| 92.33915953886203 | 0.13 | -0.85 | 0.11 | 0.98 |
| 92.49721085905541 | 0.14 | -0.85 | 0.12 | 1 |
| 92.66455931573077 | 0.14 | -0.87 | 0.13 | 1.03 |
| 92.83190777240611 | 0.13 | -0.9 | 0.13 | 1.05 |
| 92.99925622908145 | 0.12 | -0.93 | 0.14 | 1.07 |
| 93.1666046857568 | 0.09 | -0.96 | 0.16 | 1.09 |
| 93.33395314243214 | 0.09 | -0.98 | 0.16 | 1.1 |
| 93.50130159910749 | 0.09 | -0.99 | 0.16 | 1.1 |
| 93.66865005578283 | 0.07 | -1.01 | 0.17 | 1.11 |
| 93.83599851245818 | 0.07 | -1.01 | 0.18 | 1.1 |
| 94.00334696913353 | 0.04 | -1.04 | 0.19 | 1.1 |
| 94.17069542580886 | 0.01 | -1.05 | 0.2 | 1.1 |
| 94.3380438824842 | -0.02 | -1.05 | 0.21 | 1.1 |
| 94.50539233915954 | -0.04 | -1.03 | 0.21 | 1.09 |
| 94.66344365935292 | -0.07 | -1.01 | 0.21 | 1.07 |
| 94.83079211602828 | -0.11 | -1.01 | 0.22 | 1.07 |
| 94.99814057270362 | -0.15 | -1.01 | 0.23 | 1.09 |
| 95.16548902937897 | -0.19 | -1.04 | 0.25 | 1.13 |
| 95.33283748605432 | -0.23 | -1.06 | 0.26 | 1.16 |
| 95.50018594272963 | -0.27 | -1.05 | 0.26 | 1.16 |
| 95.66753439940499 | -0.31 | -1.03 | 0.26 | 1.17 |
| 95.83488285608034 | -0.36 | -1.06 | 0.28 | 1.22 |
| 96.00223131275567 | -0.41 | -1.05 | 0.29 | 1.24 |
| 96.16957976943102 | -0.47 | -1.06 | 0.3 | 1.29 |
| 96.33692822610638 | -0.52 | -1.1 | 0.31 | 1.36 |
| 96.50427668278171 | -0.58 | -1.11 | 0.32 | 1.41 |
| 96.67162513945706 | -0.63 | -1.07 | 0.32 | 1.42 |
| 96.8389735961324 | -0.7 | -1.08 | 0.33 | 1.46 |
| 96.99702491632577 | -0.78 | -1.1 | 0.35 | 1.51 |
| 97.16437337300111 | -0.84 | -1.06 | 0.35 | 1.54 |
| 97.33172182967647 | -0.91 | -1 | 0.34 | 1.54 |
| 97.49907028635181 | -0.97 | -0.93 | 0.33 | 1.54 |
| 97.66641874302715 | -1.03 | -0.85 | 0.31 | 1.55 |
| 97.8337671997025 | -1.09 | -0.75 | 0.27 | 1.57 |
| 98.00111565637785 | -1.15 | -0.64 | 0.23 | 1.58 |
| 98.16846411305319 | -1.23 | -0.51 | 0.18 | 1.62 |
| 98.33581256972855 | -1.31 | -0.35 | 0.11 | 1.7 |
| 98.50316102640389 | -1.4 | -0.21 | 0.04 | 1.81 |
| 98.67050948307921 | -1.48 | -0.06 | -0.01 | 1.9 |
| 98.83785793975456 | -1.55 | 0.12 | -0.06 | 2.05 |
| 99.0052063964299 | -1.61 | 0.29 | -0.11 | 2.2 |
| 99.17255485310525 | -1.67 | 0.47 | -0.15 | 2.34 |
| 99.33060617329863 | -1.69 | 0.6 | -0.17 | 2.41 |
| 99.49795462997399 | -1.72 | 0.72 | -0.2 | 2.45 |
| 99.66530308664933 | -1.75 | 0.84 | -0.22 | 2.48 |
| 99.83265154332467 | -1.77 | 0.96 | -0.24 | 2.51 |
| 100.0 | -1.8 | 1.08 | -0.27 | 2.55 |